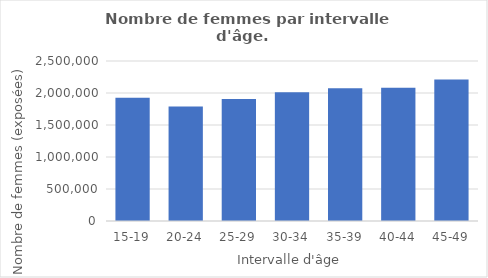
| Category | Series 0 |
|---|---|
| 15-19 | 1924553 |
| 20-24 | 1787600 |
| 25-29 | 1906032 |
| 30-34 | 2011783 |
| 35-39 | 2072822 |
| 40-44 | 2080585 |
| 45-49 | 2210607 |